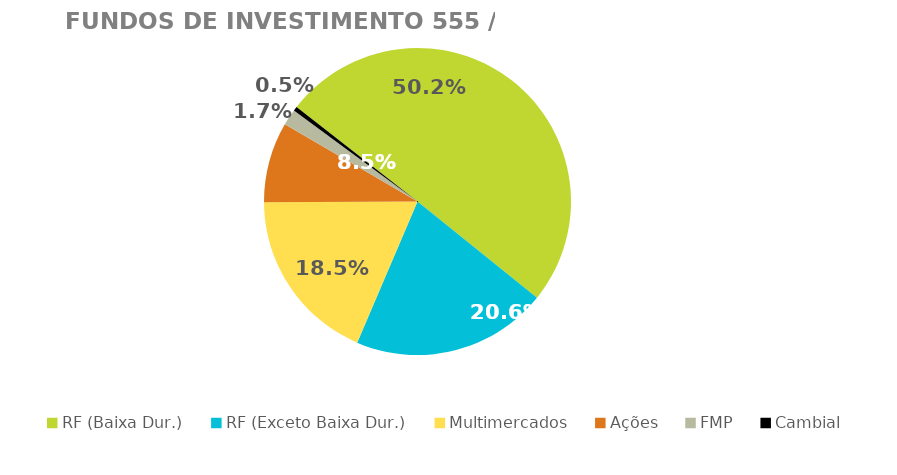
| Category | Fundos de Investimento 555 / FMP |
|---|---|
| RF (Baixa Dur.) | 0.502 |
| RF (Exceto Baixa Dur.) | 0.206 |
| Multimercados | 0.185 |
| Ações | 0.085 |
| FMP | 0.017 |
| Cambial | 0.005 |